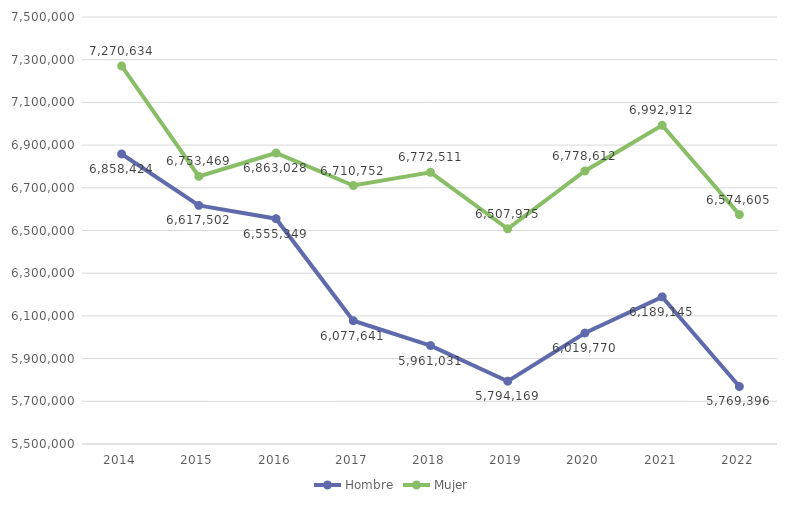
| Category | Hombre | Mujer |
|---|---|---|
| 2014.0 | 6858424 | 7270634 |
| 2015.0 | 6617502 | 6753469 |
| 2016.0 | 6555349 | 6863028 |
| 2017.0 | 6077641 | 6710752 |
| 2018.0 | 5961031 | 6772511 |
| 2019.0 | 5794169 | 6507975 |
| 2020.0 | 6019770 | 6778612 |
| 2021.0 | 6189145 | 6992912 |
| 2022.0 | 5769396 | 6574605 |